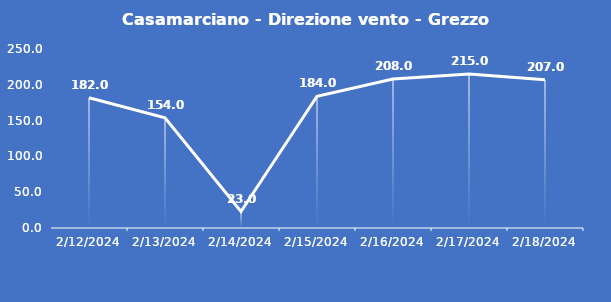
| Category | Casamarciano - Direzione vento - Grezzo (°N) |
|---|---|
| 2/12/24 | 182 |
| 2/13/24 | 154 |
| 2/14/24 | 23 |
| 2/15/24 | 184 |
| 2/16/24 | 208 |
| 2/17/24 | 215 |
| 2/18/24 | 207 |